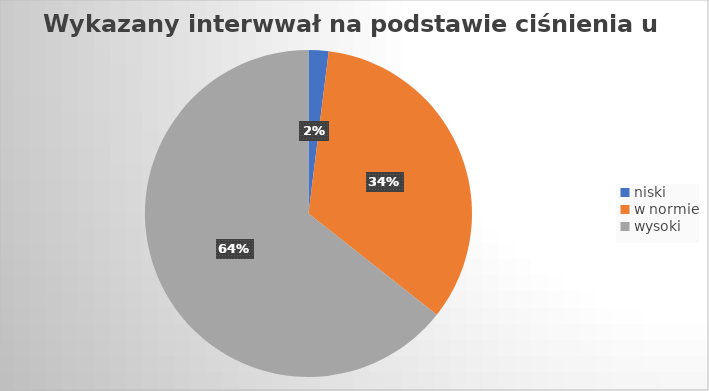
| Category | Series 0 |
|---|---|
| niski | 1.98 |
| w normie | 33.663 |
| wysoki | 64.356 |